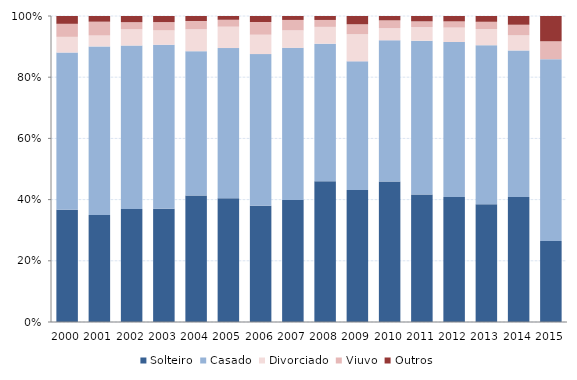
| Category | Solteiro | Casado | Divorciado | Viuvo | Outros |
|---|---|---|---|---|---|
| 2000.0 | 36.648 | 51.42 | 5.114 | 4.261 | 2.557 |
| 2001.0 | 34.938 | 55.124 | 3.571 | 4.503 | 1.863 |
| 2002.0 | 36.941 | 53.391 | 5.339 | 2.309 | 2.02 |
| 2003.0 | 36.972 | 53.638 | 4.695 | 2.7 | 1.995 |
| 2004.0 | 41.331 | 47.165 | 7.149 | 2.712 | 1.643 |
| 2005.0 | 40.44 | 49.087 | 6.982 | 2.256 | 1.235 |
| 2006.0 | 38.012 | 49.536 | 6.335 | 4.151 | 1.966 |
| 2007.0 | 39.91 | 49.679 | 5.72 | 3.406 | 1.285 |
| 2008.0 | 45.995 | 44.961 | 5.491 | 2.261 | 1.292 |
| 2009.0 | 43.155 | 42.026 | 8.864 | 3.251 | 2.704 |
| 2010.0 | 45.932 | 46.135 | 3.987 | 2.522 | 1.424 |
| 2011.0 | 41.679 | 50.256 | 4.454 | 1.866 | 1.745 |
| 2012.0 | 40.867 | 50.628 | 4.713 | 2.032 | 1.76 |
| 2013.0 | 38.482 | 51.964 | 5.295 | 2.367 | 1.893 |
| 2014.0 | 40.857 | 47.896 | 4.948 | 3.44 | 2.858 |
| 2015.0 | 26.485 | 59.409 | 0 | 5.841 | 8.264 |